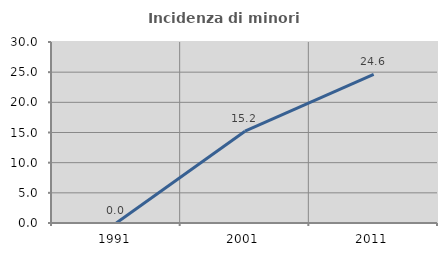
| Category | Incidenza di minori stranieri |
|---|---|
| 1991.0 | 0 |
| 2001.0 | 15.217 |
| 2011.0 | 24.631 |